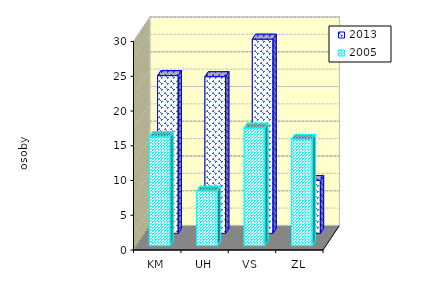
| Category | 2013 | 2005 |
|---|---|---|
| KM | 22.698 | 15.665 |
| UH | 22.546 | 7.85 |
| VS | 27.947 | 16.916 |
| ZL | 7.601 | 15.289 |